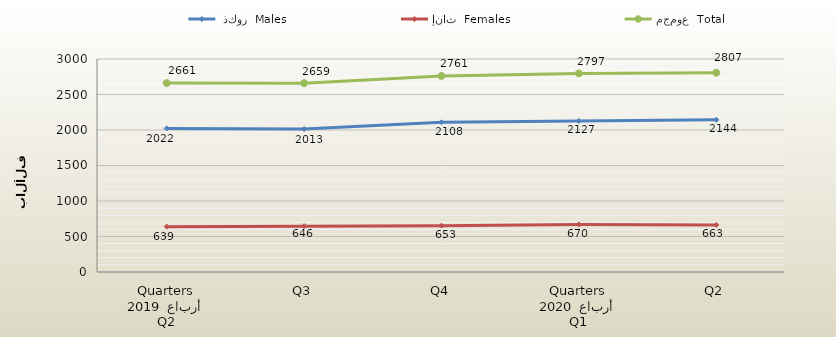
| Category |  ذكور  Males | إناث  Females | مجموع  Total |
|---|---|---|---|
| 0 | 2022 | 639 | 2661 |
| 1 | 2013 | 646 | 2659 |
| 2 | 2108 | 653 | 2761 |
| 3 | 2127 | 670 | 2797 |
| 4 | 2144 | 663 | 2807 |